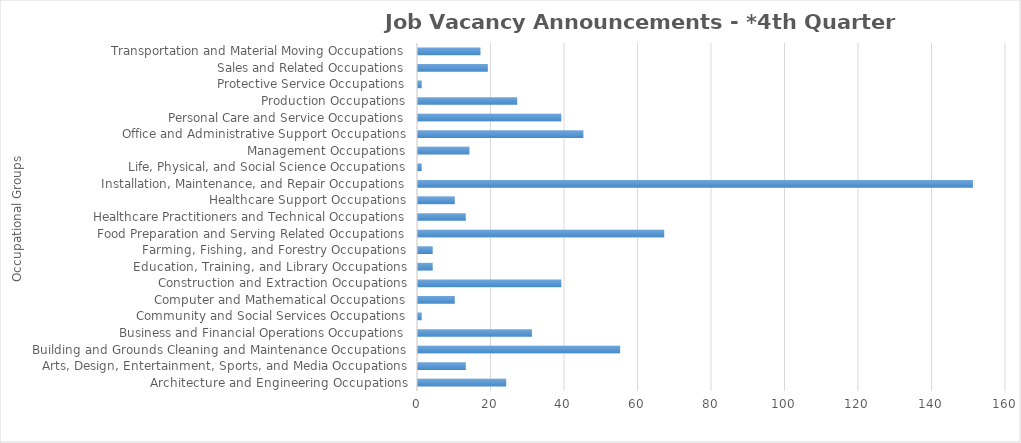
| Category | Total JVAs |
|---|---|
| Architecture and Engineering Occupations | 24 |
| Arts, Design, Entertainment, Sports, and Media Occupations | 13 |
| Building and Grounds Cleaning and Maintenance Occupations | 55 |
| Business and Financial Operations Occupations | 31 |
| Community and Social Services Occupations | 1 |
| Computer and Mathematical Occupations | 10 |
| Construction and Extraction Occupations | 39 |
| Education, Training, and Library Occupations | 4 |
| Farming, Fishing, and Forestry Occupations | 4 |
| Food Preparation and Serving Related Occupations | 67 |
| Healthcare Practitioners and Technical Occupations | 13 |
| Healthcare Support Occupations | 10 |
| Installation, Maintenance, and Repair Occupations | 151 |
| Life, Physical, and Social Science Occupations | 1 |
| Management Occupations | 14 |
| Office and Administrative Support Occupations | 45 |
| Personal Care and Service Occupations | 39 |
| Production Occupations | 27 |
| Protective Service Occupations | 1 |
| Sales and Related Occupations | 19 |
| Transportation and Material Moving Occupations | 17 |